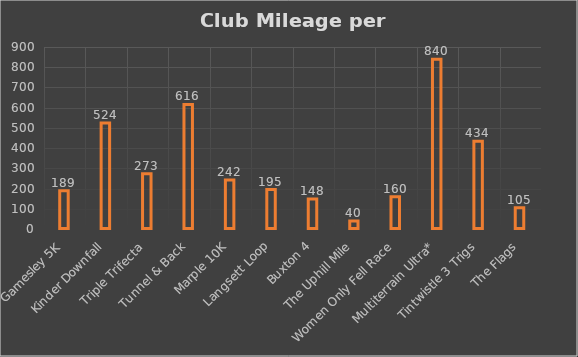
| Category | Series 0 |
|---|---|
| Gamesley 5K | 189.1 |
| Kinder Downfall | 523.8 |
| Triple Trifecta | 272.8 |
| Tunnel & Back | 615.7 |
| Marple 10K | 241.8 |
| Langsett Loop | 195 |
| Buxton 4 | 148 |
| The Uphill Mile | 40 |
| Women Only Fell Race | 160 |
| Multiterrain Ultra* | 840 |
| Tintwistle 3 Trigs | 434 |
| The Flags | 105 |